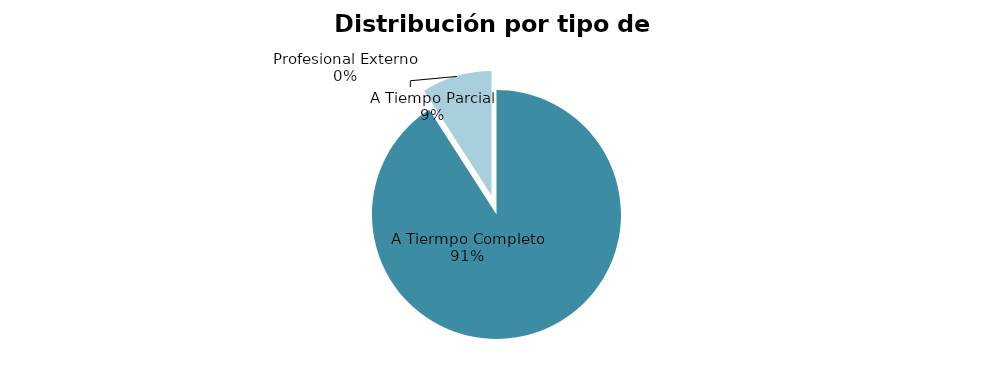
| Category | 10 |
|---|---|
| A Tiermpo Completo | 10 |
| Profesional Externo | 0 |
| A Tiempo Parcial | 1 |